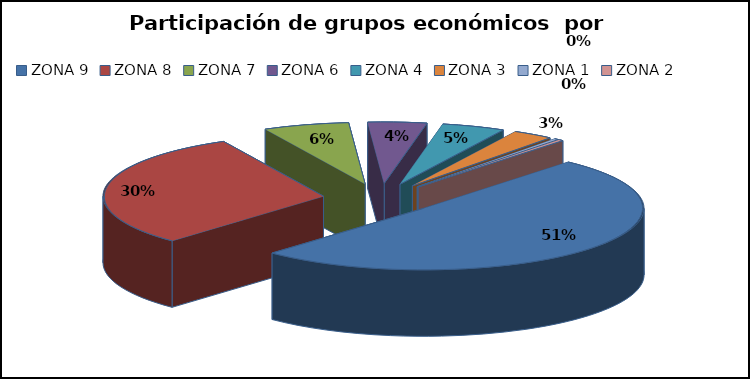
| Category | 2020 |
|---|---|
| ZONA 9 | 153 |
| ZONA 8 | 92 |
| ZONA 7 | 19 |
| ZONA 6 | 13 |
| ZONA 4 | 14 |
| ZONA 3 | 9 |
| ZONA 1 | 1 |
| ZONA 2 | 1 |